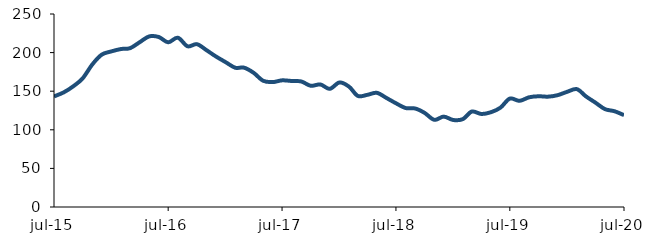
| Category | Series 0 |
|---|---|
| 2015-07-01 | 143.226 |
| 2015-08-01 | 148.458 |
| 2015-09-01 | 156.415 |
| 2015-10-01 | 166.693 |
| 2015-11-01 | 184.764 |
| 2015-12-01 | 197.352 |
| 2016-01-01 | 201.576 |
| 2016-02-01 | 204.637 |
| 2016-03-01 | 205.749 |
| 2016-04-01 | 213.572 |
| 2016-05-01 | 220.946 |
| 2016-06-01 | 220.163 |
| 2016-07-01 | 213.334 |
| 2016-08-01 | 219.303 |
| 2016-09-01 | 208.196 |
| 2016-10-01 | 210.924 |
| 2016-11-01 | 203.06 |
| 2016-12-01 | 194.983 |
| 2017-01-01 | 187.636 |
| 2017-02-01 | 180.379 |
| 2017-03-01 | 180.511 |
| 2017-04-01 | 173.799 |
| 2017-05-01 | 163.563 |
| 2017-06-01 | 161.802 |
| 2017-07-01 | 164.052 |
| 2017-08-01 | 163.237 |
| 2017-09-01 | 162.55 |
| 2017-10-01 | 157.011 |
| 2017-11-01 | 158.724 |
| 2017-12-01 | 153.028 |
| 2018-01-01 | 161.334 |
| 2018-02-01 | 155.786 |
| 2018-03-01 | 143.852 |
| 2018-04-01 | 145.362 |
| 2018-05-01 | 147.884 |
| 2018-06-01 | 141.123 |
| 2018-07-01 | 134.386 |
| 2018-08-01 | 128.206 |
| 2018-09-01 | 127.539 |
| 2018-10-01 | 121.857 |
| 2018-11-01 | 112.902 |
| 2018-12-01 | 117.091 |
| 2019-01-01 | 112.658 |
| 2019-02-01 | 113.952 |
| 2019-03-01 | 123.641 |
| 2019-04-01 | 120.497 |
| 2019-05-01 | 122.708 |
| 2019-06-01 | 128.675 |
| 2019-07-01 | 140.452 |
| 2019-08-01 | 137.511 |
| 2019-09-01 | 142.134 |
| 2019-10-01 | 143.438 |
| 2019-11-01 | 142.938 |
| 2019-12-01 | 144.831 |
| 2020-01-01 | 149.242 |
| 2020-02-01 | 152.669 |
| 2020-03-01 | 143.292 |
| 2020-04-01 | 135.035 |
| 2020-05-01 | 126.788 |
| 2020-06-01 | 124.002 |
| 2020-07-01 | 118.983 |